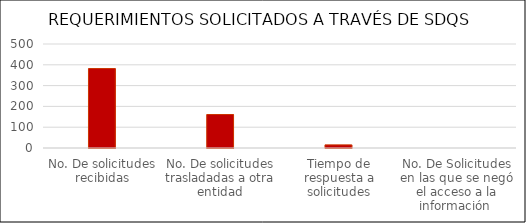
| Category | Series 0 |
|---|---|
| No. De solicitudes recibidas | 382 |
| No. De solicitudes trasladadas a otra entidad | 161 |
| Tiempo de respuesta a solicitudes | 15 |
| No. De Solicitudes en las que se negó el acceso a la información  | 0 |